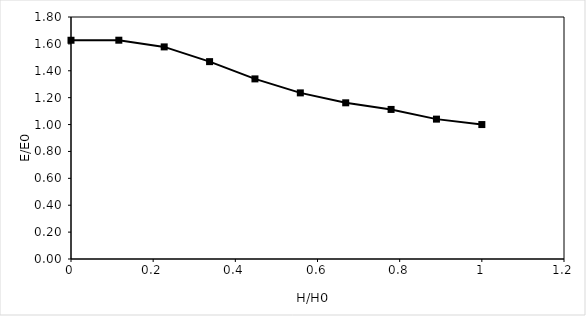
| Category | Head (feet) |
|---|---|
| 1.0 | 1 |
| 0.8895522388059701 | 1.04 |
| 0.7791044776119403 | 1.113 |
| 0.6686567164179105 | 1.162 |
| 0.5582089552238807 | 1.236 |
| 0.44776119402985076 | 1.34 |
| 0.33731343283582094 | 1.468 |
| 0.22686567164179103 | 1.578 |
| 0.11641791044776115 | 1.627 |
| 0.0 | 1.627 |